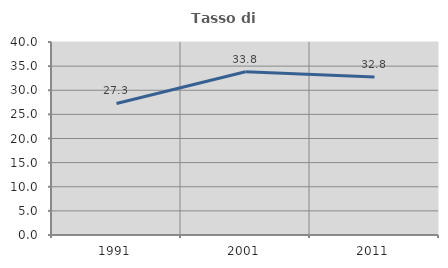
| Category | Tasso di occupazione   |
|---|---|
| 1991.0 | 27.255 |
| 2001.0 | 33.826 |
| 2011.0 | 32.753 |